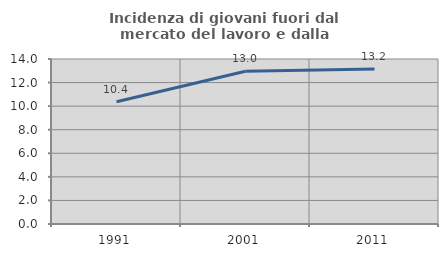
| Category | Incidenza di giovani fuori dal mercato del lavoro e dalla formazione  |
|---|---|
| 1991.0 | 10.366 |
| 2001.0 | 12.963 |
| 2011.0 | 13.158 |